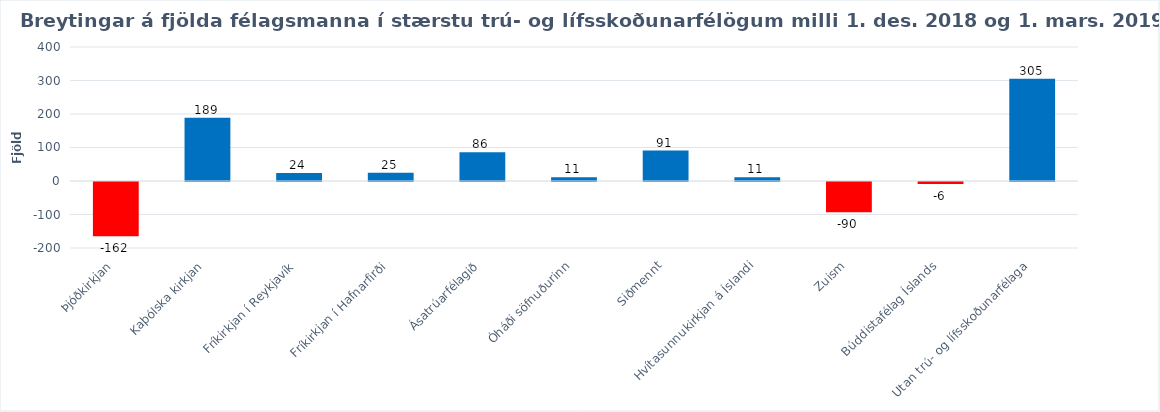
| Category | Series 0 |
|---|---|
| Þjóðkirkjan | -162 |
| Kaþólska kirkjan | 189 |
| Fríkirkjan í Reykjavík | 24 |
| Fríkirkjan í Hafnarfirði | 25 |
| Ásatrúarfélagið | 86 |
| Óháði söfnuðurinn | 11 |
| Siðmennt | 91 |
| Hvítasunnukirkjan á Íslandi | 11 |
| Zuism | -90 |
| Búddistafélag Íslands | -6 |
| Utan trú- og lífsskoðunarfélaga | 305 |